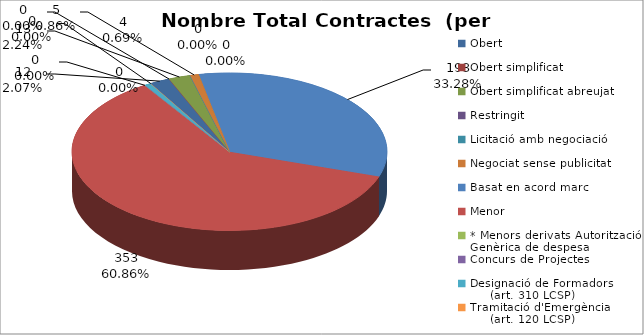
| Category | Nombre Total Contractes |
|---|---|
| Obert | 12 |
| Obert simplificat | 0 |
| Obert simplificat abreujat | 13 |
| Restringit | 0 |
| Licitació amb negociació | 0 |
| Negociat sense publicitat | 5 |
| Basat en acord marc | 193 |
| Menor | 353 |
| * Menors derivats Autorització Genèrica de despesa | 0 |
| Concurs de Projectes | 0 |
| Designació de Formadors
     (art. 310 LCSP) | 4 |
| Tramitació d'Emergència
     (art. 120 LCSP) | 0 |